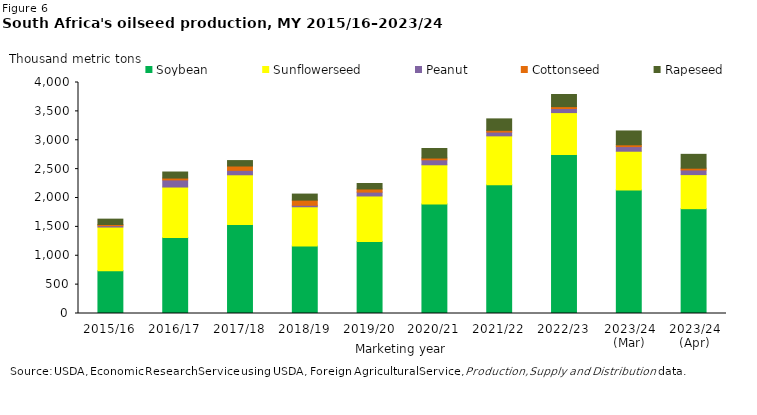
| Category | Soybean | Sunflowerseed | Peanut | Cottonseed | Rapeseed |
|---|---|---|---|---|---|
| 2015/16 | 742 | 755 | 24 | 20 | 93 |
| 2016/17 | 1316 | 874 | 123 | 32 | 105 |
| 2017/18 | 1540 | 862 | 76 | 76 | 94 |
| 2018/19 | 1170 | 678 | 26 | 89 | 105 |
| 2019/20 | 1246 | 789 | 67 | 54 | 95 |
| 2020/21 | 1897 | 678 | 86 | 31 | 165 |
| 2021/22 | 2230 | 846 | 65 | 31 | 198 |
| 2022/23 | 2755 | 724 | 70 | 33 | 210 |
| 2023/24 (Mar) | 2140 | 670 | 80 | 31 | 240 |
| 2023/24 (Apr) | 1815 | 590 | 80 | 31 | 240 |